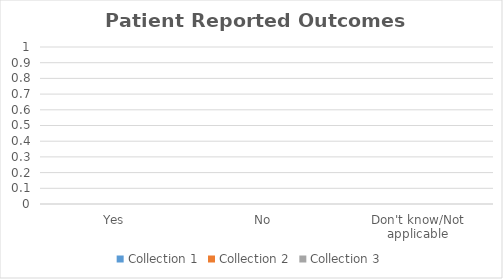
| Category | Collection 1 | Collection 2 | Collection 3 |
|---|---|---|---|
| Yes | 0 | 0 | 0 |
| No  | 0 | 0 | 0 |
| Don't know/Not applicable | 0 | 0 | 0 |